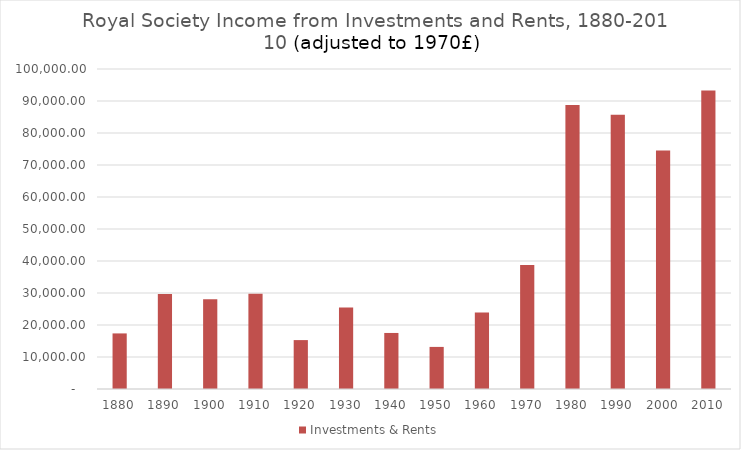
| Category | Investments & Rents |
|---|---|
| 1880.0 | 17370.725 |
| 1890.0 | 29725.11 |
| 1900.0 | 28029.21 |
| 1910.0 | 29784.926 |
| 1920.0 | 15283.257 |
| 1930.0 | 25448.531 |
| 1940.0 | 17513.242 |
| 1950.0 | 13152.59 |
| 1960.0 | 23887.403 |
| 1970.0 | 38728 |
| 1980.0 | 88725.248 |
| 1990.0 | 85677.514 |
| 2000.0 | 74527.148 |
| 2010.0 | 93244.242 |